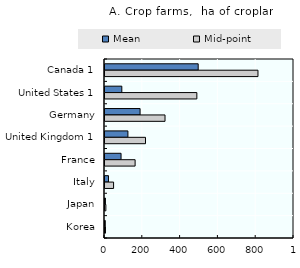
| Category | Mean | Mid-point |
|---|---|---|
| Canada 1 | 493.105 | 809.371 |
| United States 1 | 89 | 486 |
| Germany | 185.613 | 317.6 |
| United Kingdom 1 | 121.2 | 214.3 |
| France | 84.93 | 159.35 |
| Italy | 18.447 | 45.4 |
| Japan | 2.2 | 4.6 |
| Korea | 1.3 | 2.4 |